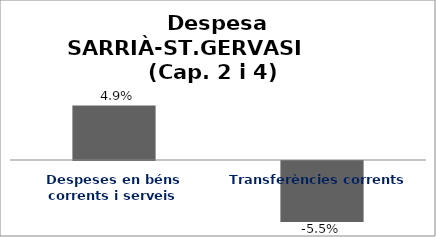
| Category | Series 0 |
|---|---|
| Despeses en béns corrents i serveis | 0.049 |
| Transferències corrents | -0.055 |